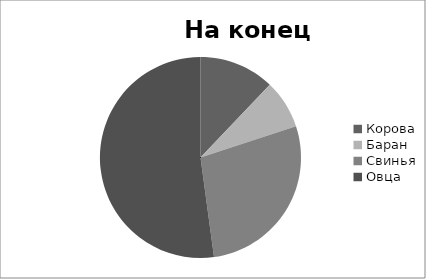
| Category | Series 0 |
|---|---|
| Корова | 1050 |
| Баран | 680 |
| Свинья | 2420 |
| Овца | 4522 |